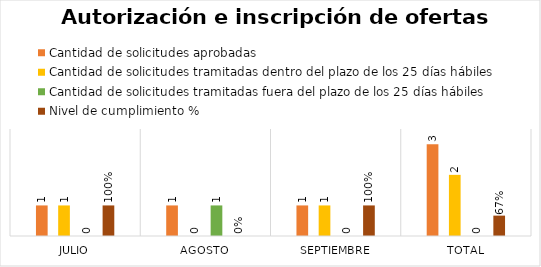
| Category | Cantidad de solicitudes aprobadas | Cantidad de solicitudes tramitadas dentro del plazo de los 25 días hábiles | Cantidad de solicitudes tramitadas fuera del plazo de los 25 días hábiles | Nivel de cumplimiento |
|---|---|---|---|---|
| Julio | 1 | 1 | 0 | 1 |
| Agosto | 1 | 0 | 1 | 0 |
| Septiembre | 1 | 1 | 0 | 1 |
| Total | 3 | 2 | 0 | 0.667 |